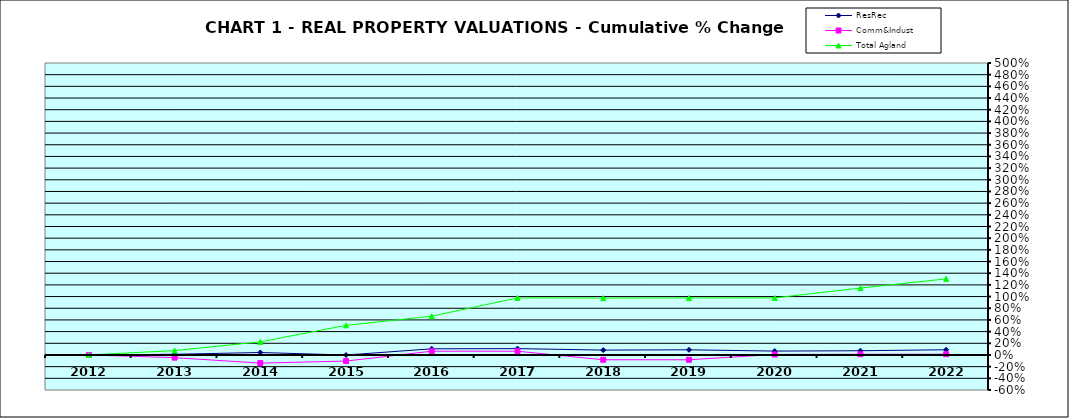
| Category | ResRec | Comm&Indust | Total Agland |
|---|---|---|---|
| 2012.0 | 0 | 0 | 0 |
| 2013.0 | 0.012 | -0.046 | 0.075 |
| 2014.0 | 0.042 | -0.14 | 0.224 |
| 2015.0 | -0.001 | -0.104 | 0.507 |
| 2016.0 | 0.106 | 0.065 | 0.664 |
| 2017.0 | 0.109 | 0.065 | 0.977 |
| 2018.0 | 0.083 | -0.082 | 0.974 |
| 2019.0 | 0.088 | -0.082 | 0.976 |
| 2020.0 | 0.066 | 0.009 | 0.978 |
| 2021.0 | 0.072 | 0.012 | 1.146 |
| 2022.0 | 0.089 | 0.013 | 1.303 |